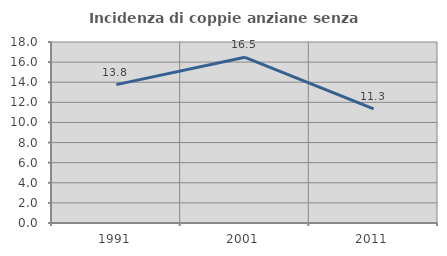
| Category | Incidenza di coppie anziane senza figli  |
|---|---|
| 1991.0 | 13.758 |
| 2001.0 | 16.475 |
| 2011.0 | 11.345 |